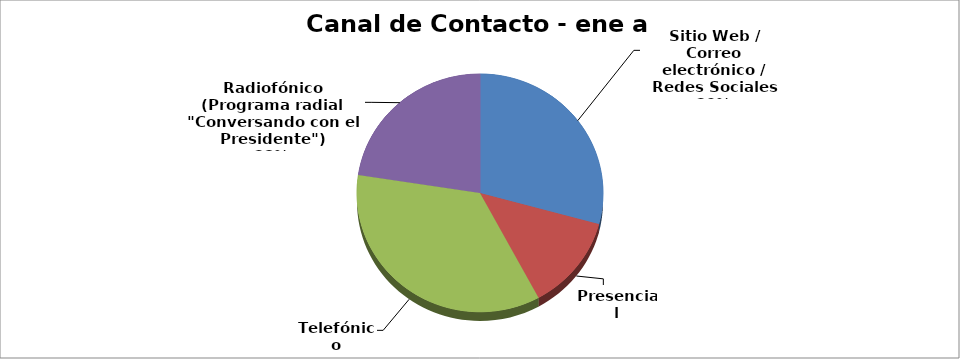
| Category | Series 0 |
|---|---|
| Sitio Web / Correo electrónico / Redes Sociales | 154 |
| Presencial | 68 |
| Telefónico | 186 |
| Radiofónico (Programa radial "Conversando con el Presidente") | 119 |